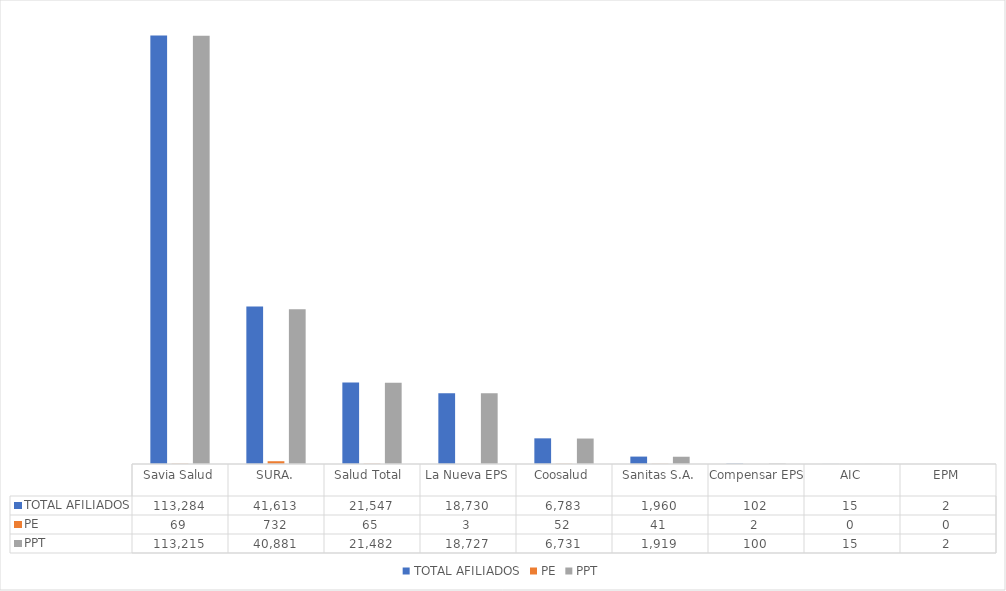
| Category | TOTAL AFILIADOS | PE | PPT |
|---|---|---|---|
| Savia Salud | 113284 | 69 | 113215 |
| SURA. | 41613 | 732 | 40881 |
| Salud Total  | 21547 | 65 | 21482 |
| La Nueva EPS | 18730 | 3 | 18727 |
| Coosalud | 6783 | 52 | 6731 |
| Sanitas S.A. | 1960 | 41 | 1919 |
| Compensar EPS | 102 | 2 | 100 |
| AIC | 15 | 0 | 15 |
| EPM | 2 | 0 | 2 |